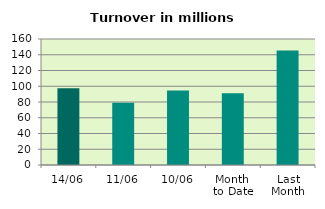
| Category | Series 0 |
|---|---|
| 14/06 | 97.441 |
| 11/06 | 79.18 |
| 10/06 | 94.638 |
| Month 
to Date | 91.199 |
| Last
Month | 145.388 |